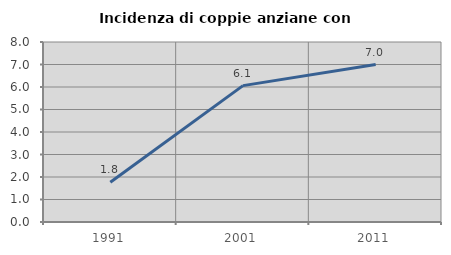
| Category | Incidenza di coppie anziane con figli |
|---|---|
| 1991.0 | 1.77 |
| 2001.0 | 6.061 |
| 2011.0 | 7 |